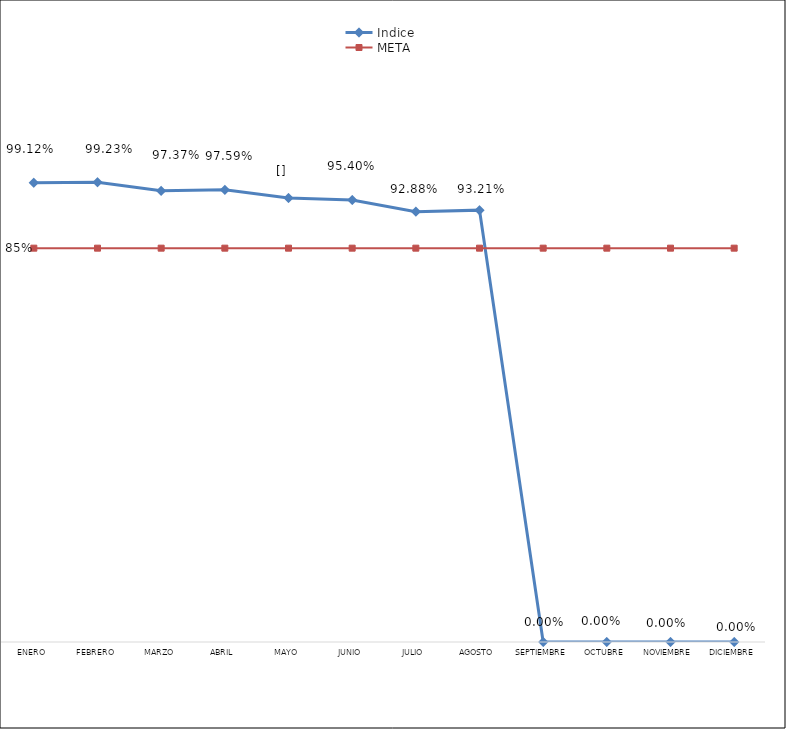
| Category | Indice | META |
|---|---|---|
| Enero | 0.991 | 0.85 |
| Febrero | 0.992 | 0.85 |
| Marzo | 0.974 | 0.85 |
| Abril | 0.976 | 0.85 |
| Mayo | 0.958 | 0.85 |
| Junio | 0.954 | 0.85 |
| Julio | 0.929 | 0.85 |
| Agosto | 0.932 | 0.85 |
| Septiembre | 0 | 0.85 |
| Octubre | 0 | 0.85 |
| Noviembre | 0 | 0.85 |
| Diciembre | 0 | 0.85 |